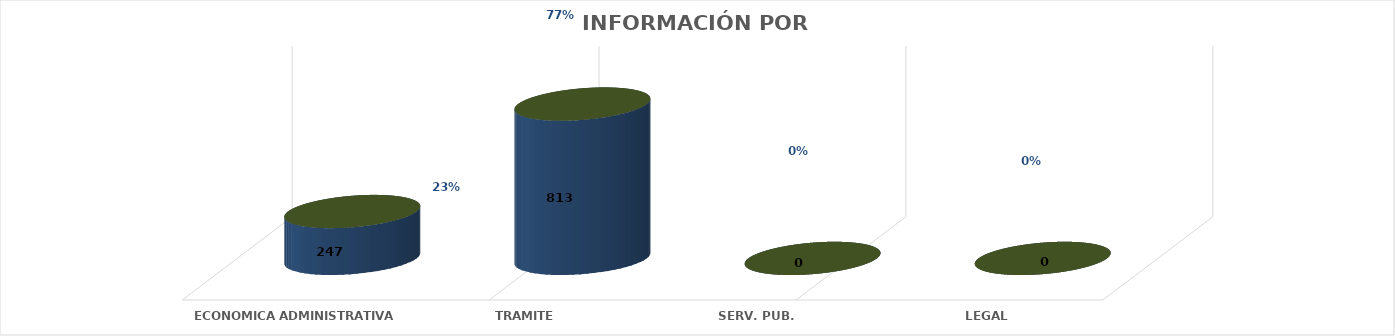
| Category | Series 0 | Series 1 | Series 2 | Series 3 | Series 4 |
|---|---|---|---|---|---|
| ECONOMICA ADMINISTRATIVA |  |  |  | 247 | 0.233 |
| TRAMITE |  |  |  | 813 | 0.767 |
| SERV. PUB. |  |  |  | 0 | 0 |
| LEGAL |  |  |  | 0 | 0 |